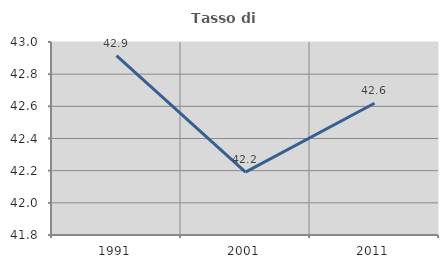
| Category | Tasso di occupazione   |
|---|---|
| 1991.0 | 42.916 |
| 2001.0 | 42.191 |
| 2011.0 | 42.619 |